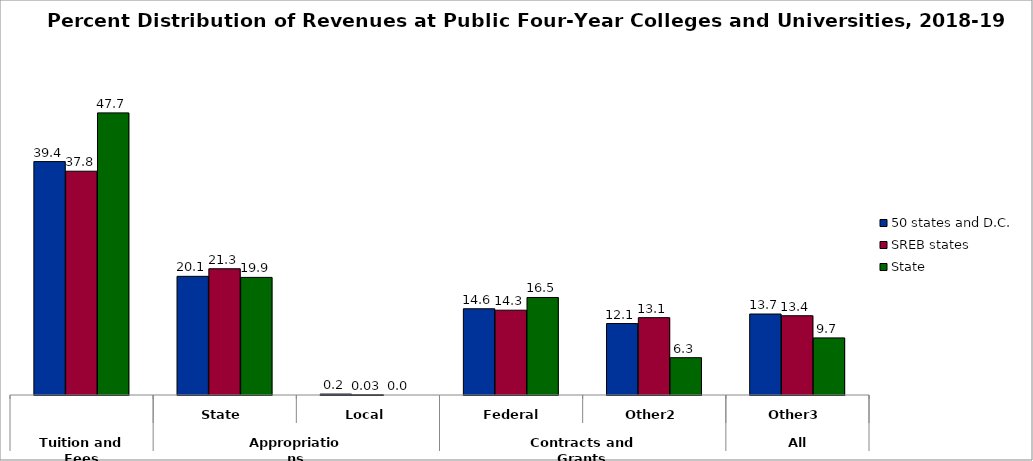
| Category | 50 states and D.C. | SREB states | State |
|---|---|---|---|
| 0 | 39.447 | 37.824 | 47.682 |
| 1 | 20.056 | 21.338 | 19.877 |
| 2 | 0.158 | 0.035 | 0 |
| 3 | 14.577 | 14.332 | 16.483 |
| 4 | 12.074 | 13.074 | 6.308 |
| 5 | 13.689 | 13.397 | 9.65 |